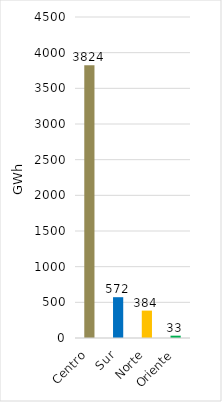
| Category | Series 0 |
|---|---|
| Centro | 3823.943 |
| Sur | 571.972 |
| Norte | 383.889 |
| Oriente | 32.609 |